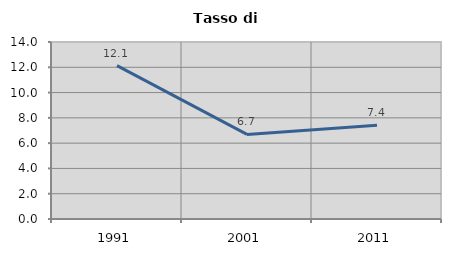
| Category | Tasso di disoccupazione   |
|---|---|
| 1991.0 | 12.128 |
| 2001.0 | 6.688 |
| 2011.0 | 7.416 |